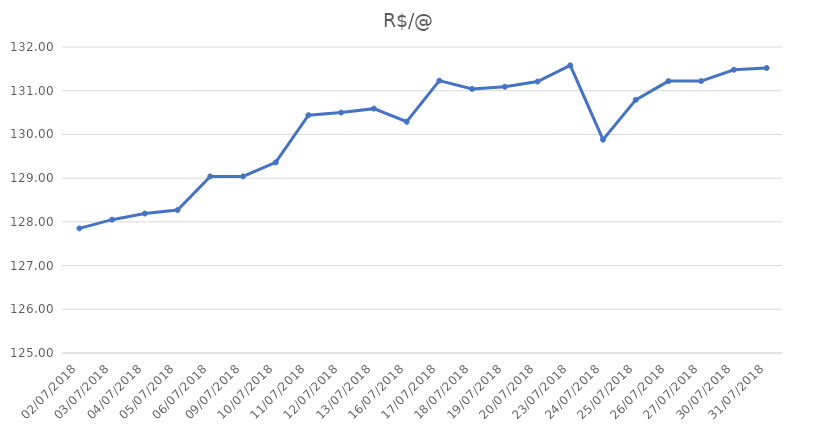
| Category | R$/@ |
|---|---|
| 02/07/2018 | 127.85 |
| 03/07/2018 | 128.05 |
| 04/07/2018 | 128.19 |
| 05/07/2018 | 128.27 |
| 06/07/2018 | 129.04 |
| 09/07/2018 | 129.04 |
| 10/07/2018 | 129.36 |
| 11/07/2018 | 130.44 |
| 12/07/2018 | 130.5 |
| 13/07/2018 | 130.59 |
| 16/07/2018 | 130.29 |
| 17/07/2018 | 131.23 |
| 18/07/2018 | 131.04 |
| 19/07/2018 | 131.09 |
| 20/07/2018 | 131.21 |
| 23/07/2018 | 131.58 |
| 24/07/2018 | 129.88 |
| 25/07/2018 | 130.79 |
| 26/07/2018 | 131.22 |
| 27/07/2018 | 131.22 |
| 30/07/2018 | 131.48 |
| 31/07/2018 | 131.52 |